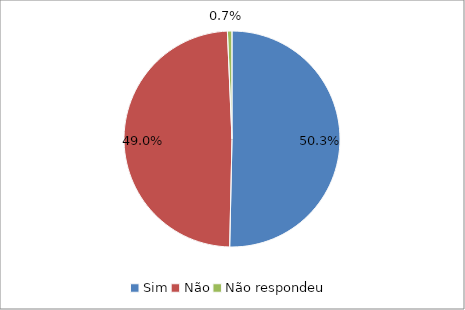
| Category | Series 0 |
|---|---|
| Sim | 0.503 |
| Não | 0.49 |
| Não respondeu | 0.007 |